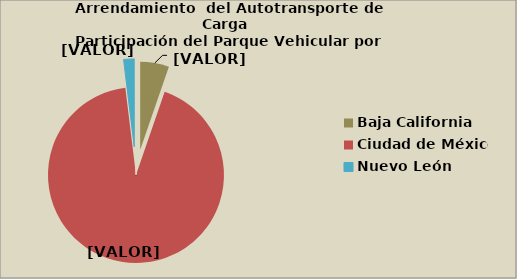
| Category | Series 0 |
|---|---|
| Baja California | 5.281 |
| Ciudad de México | 92.78 |
| Nuevo León | 1.924 |
| Quintana Roo | 0.014 |